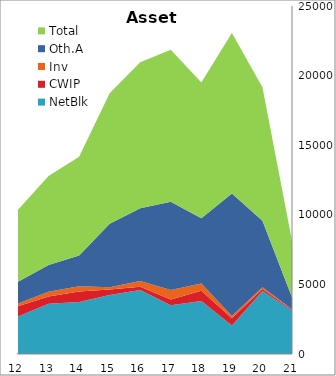
| Category | NetBlk | CWIP | Inv | Oth.A | Total |
|---|---|---|---|---|---|
| 2012-03-31 | 2696.45 | 740.94 | 184.31 | 1562.3 | 5184 |
| 2013-03-31 | 3607.1 | 522.99 | 347.98 | 1914.04 | 6392.11 |
| 2014-03-31 | 3728.58 | 762.61 | 369.47 | 2221.01 | 7081.67 |
| 2015-03-31 | 4230.75 | 403.36 | 159.2 | 4570.17 | 9363.48 |
| 2016-03-31 | 4600.35 | 238.41 | 404.18 | 5236.5 | 10479.44 |
| 2017-03-31 | 3504.67 | 410.21 | 678.09 | 6337.79 | 10930.76 |
| 2018-03-31 | 3813.33 | 724.32 | 524.04 | 4691.07 | 9752.76 |
| 2019-03-31 | 2052.34 | 522.15 | 148.83 | 8807.7 | 11531.02 |
| 2020-03-31 | 4518.14 | 150.05 | 122.14 | 4790.61 | 9580.94 |
| 2021-03-31 | 3083.47 | 56.95 | 22.13 | 720.8 | 3883.35 |